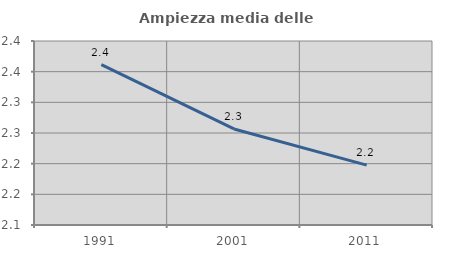
| Category | Ampiezza media delle famiglie |
|---|---|
| 1991.0 | 2.361 |
| 2001.0 | 2.257 |
| 2011.0 | 2.198 |